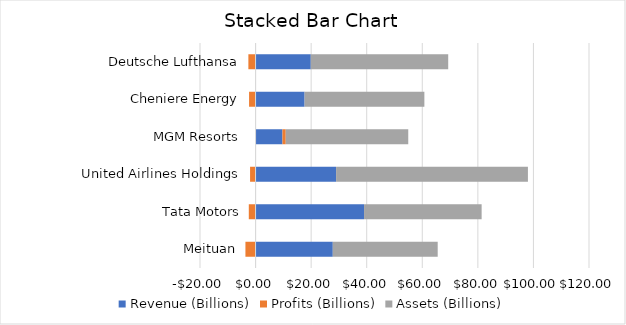
| Category | Revenue (Billions) | Profits (Billions) | Assets (Billions) |
|---|---|---|---|
| Meituan  | 27.79 | -3.65 | 37.76 |
| Tata Motors | 39.04 | -2.44 | 42.32 |
| United Airlines Holdings | 28.98 | -1.98 | 69.04 |
| MGM Resorts | 9.68 | 1.18 | 44.09 |
| Cheniere Energy | 17.64 | -2.34 | 43.11 |
| Deutsche Lufthansa | 19.87 | -2.59 | 49.46 |